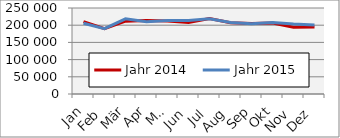
| Category | Jahr 2014 | Jahr 2015 |
|---|---|---|
| Jan | 210354.691 | 205742.88 |
| Feb | 189715.331 | 189830.008 |
| Mär | 211774.404 | 218632.518 |
| Apr | 213459.516 | 209953.47 |
| Mai | 212531.963 | 213882.773 |
| Jun | 208184.472 | 213952.556 |
| Jul | 219116.661 | 218694.079 |
| Aug | 206988.202 | 207814.449 |
| Sep | 205004.571 | 204463.688 |
| Okt | 206231.872 | 207936.661 |
| Nov | 193819.088 | 203453.152 |
| Dez | 194487.053 | 200523.453 |